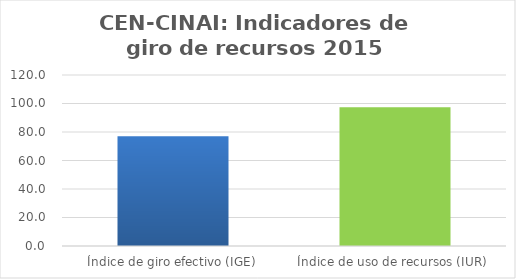
| Category | Series 0 |
|---|---|
| Índice de giro efectivo (IGE) | 76.976 |
| Índice de uso de recursos (IUR)  | 97.373 |